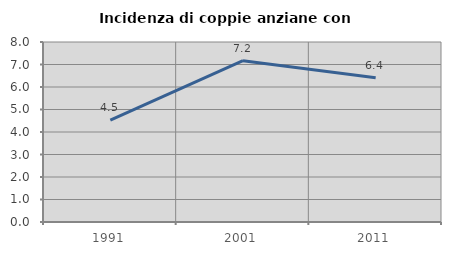
| Category | Incidenza di coppie anziane con figli |
|---|---|
| 1991.0 | 4.532 |
| 2001.0 | 7.167 |
| 2011.0 | 6.41 |